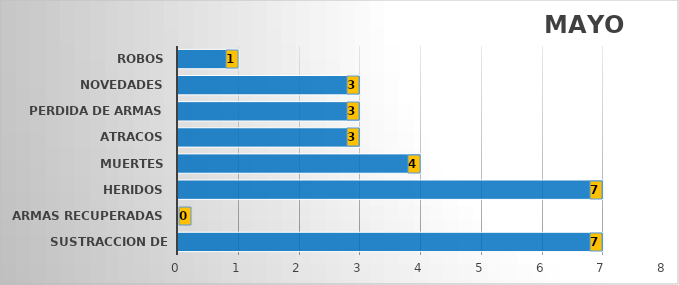
| Category | Series 1 |
|---|---|
| SUSTRACCION DE ARMAS | 7 |
| ARMAS RECUPERADAS | 0 |
| HERIDOS | 7 |
| MUERTES | 4 |
| ATRACOS | 3 |
| PERDIDA DE ARMAS | 3 |
| NOVEDADES | 3 |
| ROBOS | 1 |